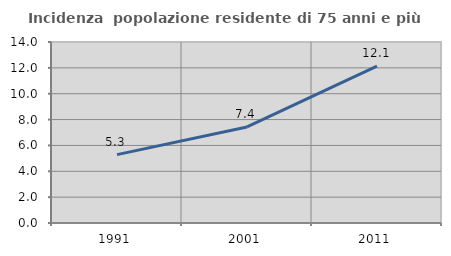
| Category | Incidenza  popolazione residente di 75 anni e più |
|---|---|
| 1991.0 | 5.288 |
| 2001.0 | 7.429 |
| 2011.0 | 12.139 |